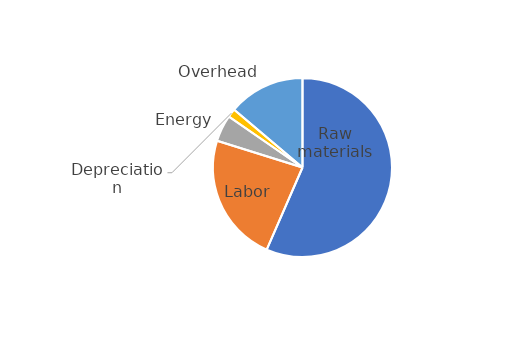
| Category | Series 0 |
|---|---|
| Raw materials | 6.309 |
| Labor | 2.6 |
| Energy | 0.535 |
| Depreciation | 0.172 |
| Overhead | 1.543 |